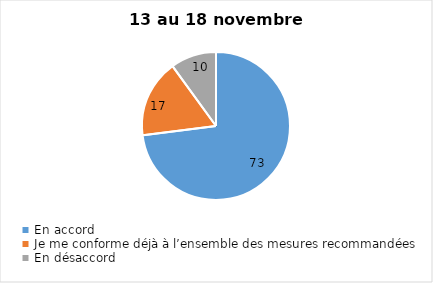
| Category | Series 0 |
|---|---|
| En accord | 73 |
| Je me conforme déjà à l’ensemble des mesures recommandées | 17 |
| En désaccord | 10 |